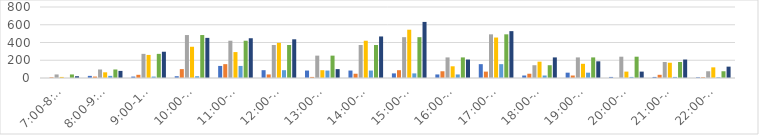
| Category | Series 0 | Series 1 | Series 2 | Series 3 | Series 4 | Series 5 | Series 6 |
|---|---|---|---|---|---|---|---|
| 7:00-8:00 | 0 | 8 | 40 | 12 | 0 | 40 | 20 |
| 8:00-9:00 | 24 | 16 | 96 | 64 | 24 | 96 | 80 |
| 9:00-10:00 | 16 | 36 | 272 | 260 | 16 | 272 | 296 |
| 10:00-11:00 | 20 | 100 | 484 | 352 | 20 | 484 | 452 |
| 11:00-12:00 | 136 | 156 | 420 | 292 | 136 | 420 | 448 |
| 12:00-13:00 | 88 | 40 | 372 | 396 | 88 | 372 | 436 |
| 13:00-14:00 | 84 | 12 | 252 | 88 | 84 | 252 | 100 |
| 14:00-15:00 | 84 | 48 | 372 | 420 | 84 | 372 | 468 |
| 15:00-16:00 | 52 | 88 | 460 | 544 | 52 | 460 | 632 |
| 16:00-17:00 | 40 | 76 | 232 | 132 | 40 | 232 | 208 |
| 17:00-18:00 | 156 | 72 | 492 | 456 | 156 | 492 | 528 |
| 18:00-19:00 | 28 | 48 | 144 | 184 | 28 | 144 | 232 |
| 19:00-20:00 | 60 | 28 | 232 | 160 | 60 | 232 | 188 |
| 20:00-21:00 | 12 | 0 | 240 | 72 | 12 | 240 | 72 |
| 21:00-22:00 | 12 | 36 | 180 | 172 | 12 | 180 | 208 |
| 22:00-23:00 | 8 | 8 | 76 | 120 | 8 | 76 | 128 |